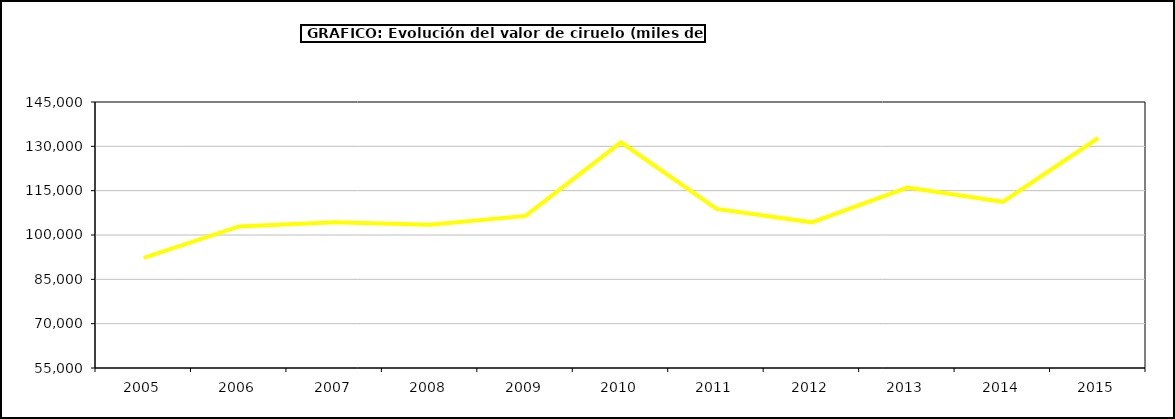
| Category | valor Ciruelo |
|---|---|
| 2005.0 | 92289.098 |
| 2006.0 | 102898.339 |
| 2007.0 | 104321.056 |
| 2008.0 | 103472.855 |
| 2009.0 | 106473.572 |
| 2010.0 | 131357.754 |
| 2011.0 | 108812.33 |
| 2012.0 | 104288.297 |
| 2013.0 | 116027.366 |
| 2014.0 | 111223.369 |
| 2015.0 | 132808 |